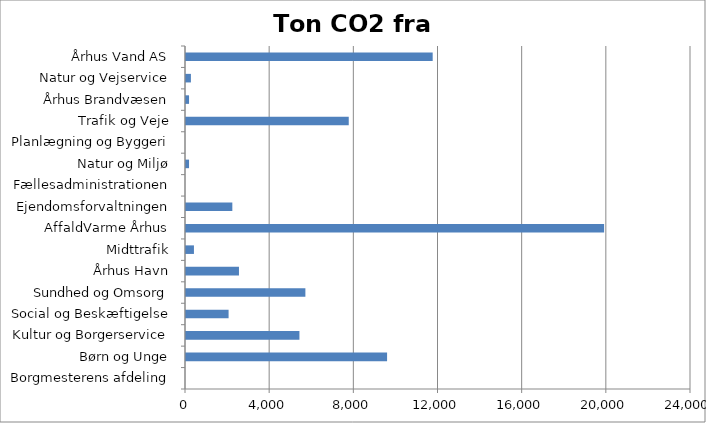
| Category | Ton CO2 |
|---|---|
| Borgmesterens afdeling | 0 |
| Børn og Unge | 9556.243 |
| Kultur og Borgerservice | 5390.826 |
| Social og Beskæftigelse | 2023.977 |
| Sundhed og Omsorg | 5673.673 |
| Århus Havn | 2517.265 |
| Midttrafik | 377.413 |
| AffaldVarme Århus | 19870.313 |
| Ejendomsforvaltningen | 2201.865 |
| Fællesadministrationen | 0 |
| Natur og Miljø | 144.56 |
| Planlægning og Byggeri | 0 |
| Trafik og Veje | 7734.48 |
| Århus Brandvæsen | 144.65 |
| Natur og Vejservice | 233.482 |
| Århus Vand AS | 11723.421 |